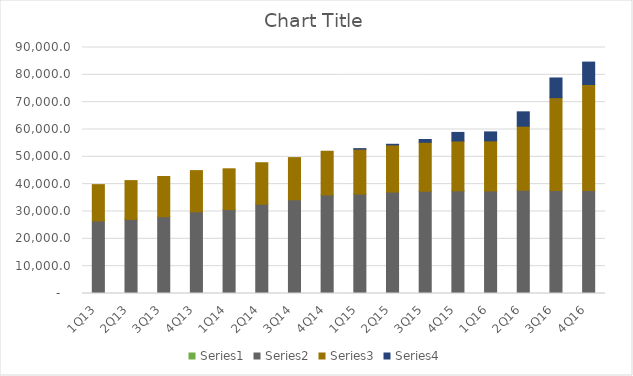
| Category | Series 2 | Series 3 | Series 4 | Series 5 | Series 8 | Series 9 | Series 10 |
|---|---|---|---|---|---|---|---|
| 1Q13 |  |  |  | 8.181 | 26524 | 13295 | 0 |
| 2Q13 |  |  |  | 11.919 | 27107 | 14186 | 0 |
| 3Q13 |  |  |  | 15.8 | 28074 | 14722 | 0 |
| 4Q13 |  |  |  | 17.4 | 29878 | 15068 | 0 |
| 1Q14 |  |  |  | 22.57 | 30655 | 14945 | 0 |
| 2Q14 |  |  |  | 29.23 | 32635 | 15179 | 0 |
| 3Q14 |  |  |  | 32.7 | 34253 | 15429 | 0 |
| 4Q14 |  |  |  | 36.4 | 36006 | 16006 | 0 |
| 1Q15 |  |  |  | 42.4 | 36331 | 16431 | 180 |
| 2Q15 |  |  |  | 45.362 | 37072 | 17246 | 232 |
| 3Q15 |  |  |  | 43.882 | 37364 | 17918 | 1018 |
| 4Q15 |  |  |  | 54.656 | 37506 | 18239 | 3134 |
| 1Q16 |  |  |  | 84.367 | 37430 | 18324 | 3286 |
| 2Q16 |  |  |  | 112.894 | 37629 | 23474 | 5250 |
| 3Q16 |  |  |  | 129.839 | 37582 | 33939 | 7204 |
| 4Q16 |  |  |  | 176.1 | 37549 | 38731 | 8204 |